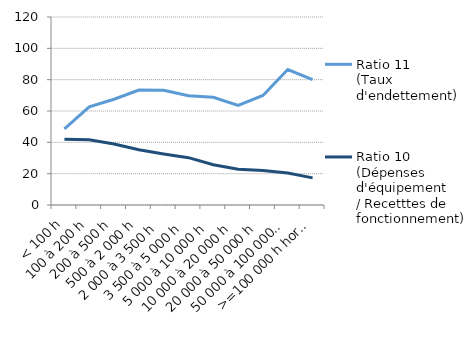
| Category | Ratio 11
(Taux d'endettement) | Ratio 10 
(Dépenses d'équipement
/ Recetttes de fonctionnement) |
|---|---|---|
| < 100 h | 48.57 | 42.011 |
| 100 à 200 h | 62.661 | 41.672 |
| 200 à 500 h | 67.529 | 38.907 |
| 500 à 2 000 h | 73.403 | 35.233 |
| 2 000 à 3 500 h | 73.282 | 32.546 |
| 3 500 à 5 000 h | 69.78 | 30.206 |
| 5 000 à 10 000 h | 68.721 | 25.68 |
| 10 000 à 20 000 h | 63.541 | 22.785 |
| 20 000 à 50 000 h | 69.903 | 21.994 |
| 50 000 à 100 000 h | 86.441 | 20.442 |
| >=100 000 h hors Paris | 80.041 | 17.303 |